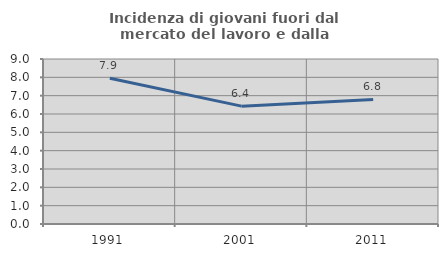
| Category | Incidenza di giovani fuori dal mercato del lavoro e dalla formazione  |
|---|---|
| 1991.0 | 7.945 |
| 2001.0 | 6.429 |
| 2011.0 | 6.797 |